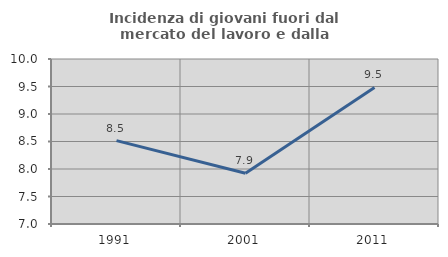
| Category | Incidenza di giovani fuori dal mercato del lavoro e dalla formazione  |
|---|---|
| 1991.0 | 8.515 |
| 2001.0 | 7.922 |
| 2011.0 | 9.483 |